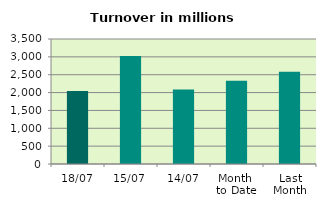
| Category | Series 0 |
|---|---|
| 18/07 | 2042.656 |
| 15/07 | 3024.457 |
| 14/07 | 2086.449 |
| Month 
to Date | 2329.272 |
| Last
Month | 2579.746 |